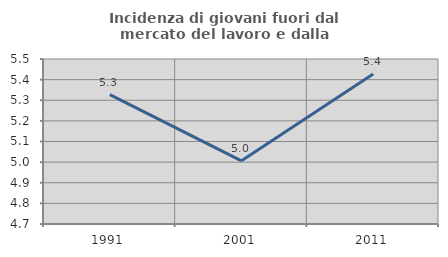
| Category | Incidenza di giovani fuori dal mercato del lavoro e dalla formazione  |
|---|---|
| 1991.0 | 5.327 |
| 2001.0 | 5.006 |
| 2011.0 | 5.427 |